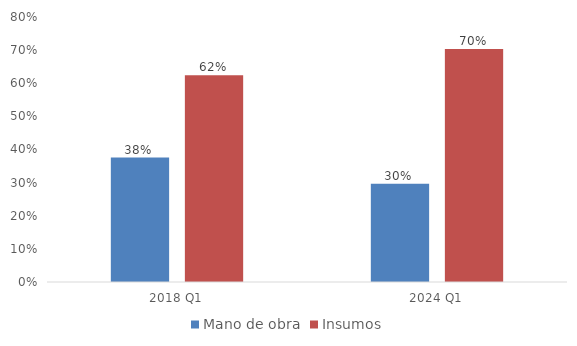
| Category | Mano de obra | Insumos |
|---|---|---|
| 2018 Q1 | 0.376 | 0.624 |
| 2024 Q1 | 0.296 | 0.704 |